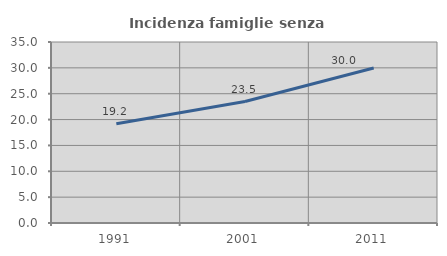
| Category | Incidenza famiglie senza nuclei |
|---|---|
| 1991.0 | 19.207 |
| 2001.0 | 23.485 |
| 2011.0 | 29.986 |